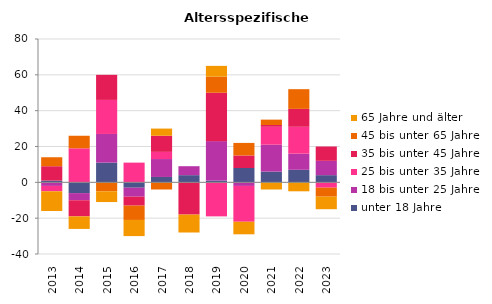
| Category | unter 18 Jahre | 18 bis unter 25 Jahre | 25 bis unter 35 Jahre | 35 bis unter 45 Jahre | 45 bis unter 65 Jahre | 65 Jahre und älter |
|---|---|---|---|---|---|---|
| 2013.0 | 1 | -2 | -3 | 8 | 5 | -11 |
| 2014.0 | -6 | -4 | 19 | -9 | 7 | -7 |
| 2015.0 | 11 | 16 | 19 | 14 | -5 | -6 |
| 2016.0 | -3 | -5 | 11 | -5 | -8 | -9 |
| 2017.0 | 3 | 10 | 4 | 9 | -4 | 4 |
| 2018.0 | 4 | 5 | 0 | -18 | 0 | -10 |
| 2019.0 | 1 | 22 | -19 | 27 | 9 | 6 |
| 2020.0 | 8 | -2 | -20 | 7 | 7 | -7 |
| 2021.0 | 6 | 15 | 10 | 1 | 3 | -4 |
| 2022.0 | 7 | 9 | 15 | 10 | 11 | -5 |
| 2023.0 | 4 | 8 | -3 | 8 | -5 | -7 |